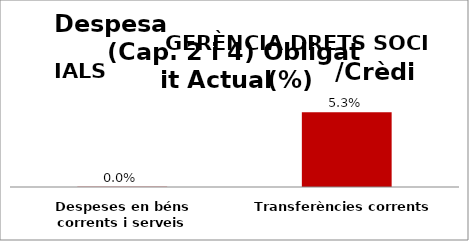
| Category | Series 0 |
|---|---|
| Despeses en béns corrents i serveis | 0 |
| Transferències corrents | 0.053 |